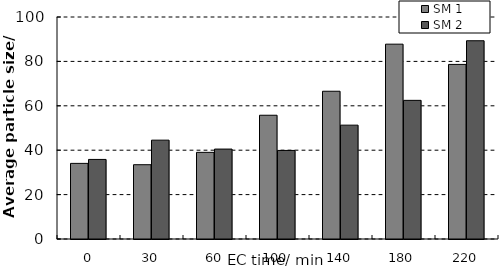
| Category | SM 1 | SM 2 |
|---|---|---|
| 0.0 | 34.06 | 35.844 |
| 30.0 | 33.466 | 44.53 |
| 60.0 | 39.03 | 40.505 |
| 100.0 | 55.745 | 39.888 |
| 140.0 | 66.555 | 51.287 |
| 180.0 | 87.766 | 62.454 |
| 220.0 | 78.639 | 89.307 |